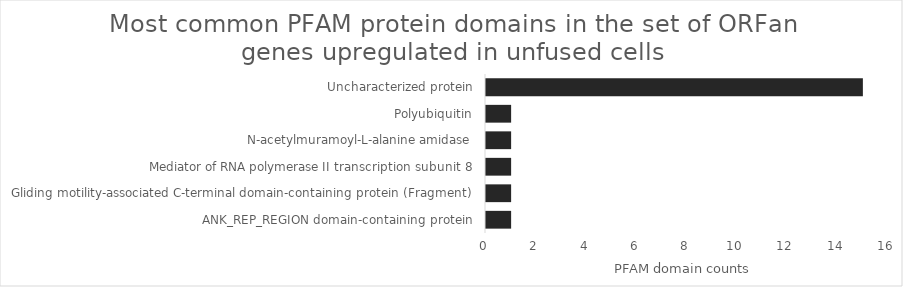
| Category | Series 0 |
|---|---|
| ANK_REP_REGION domain-containing protein | 1 |
| Gliding motility-associated C-terminal domain-containing protein (Fragment) | 1 |
| Mediator of RNA polymerase II transcription subunit 8 | 1 |
| N-acetylmuramoyl-L-alanine amidase | 1 |
| Polyubiquitin | 1 |
| Uncharacterized protein | 15 |